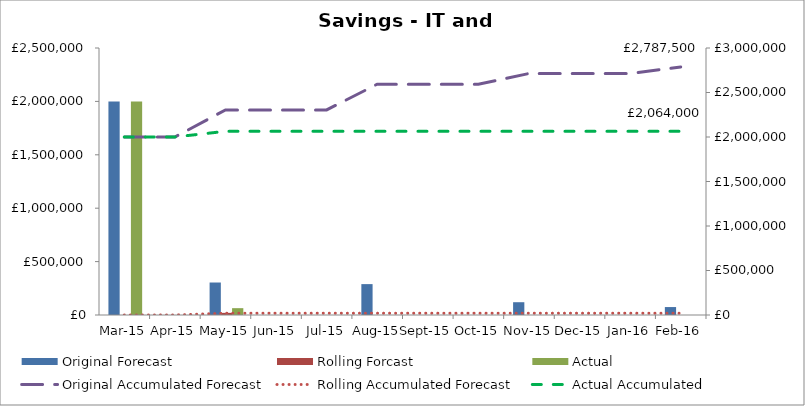
| Category | Original Forecast | Rolling Forcast | Actual |
|---|---|---|---|
| 2015-03-01 | 2000000 | 0 | 2000000 |
| 2015-04-01 | 0 | 0 | 0 |
| 2015-05-01 | 304208.33 | 20000 | 64000 |
| 2015-06-01 | 0 | 0 | 0 |
| 2015-07-01 | 0 | 0 | 0 |
| 2015-08-01 | 289208.33 | 0 | 0 |
| 2015-09-01 | 0 | 0 | 0 |
| 2015-10-01 | 0 | 0 | 0 |
| 2015-11-01 | 119708.33 | 0 | 0 |
| 2015-12-01 | 0 | 0 | 0 |
| 2016-01-01 | 0 | 0 | 0 |
| 2016-02-01 | 74375 | 0 | 0 |